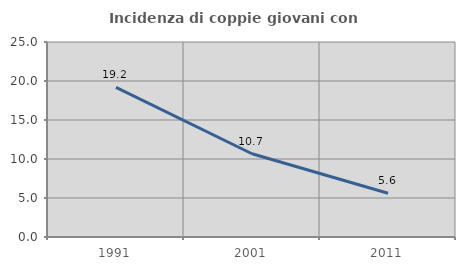
| Category | Incidenza di coppie giovani con figli |
|---|---|
| 1991.0 | 19.184 |
| 2001.0 | 10.67 |
| 2011.0 | 5.616 |